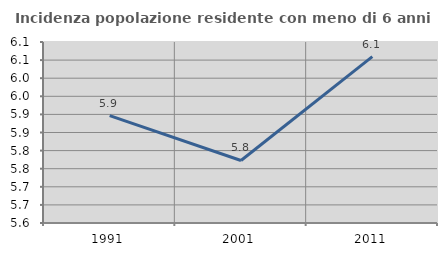
| Category | Incidenza popolazione residente con meno di 6 anni |
|---|---|
| 1991.0 | 5.897 |
| 2001.0 | 5.773 |
| 2011.0 | 6.06 |